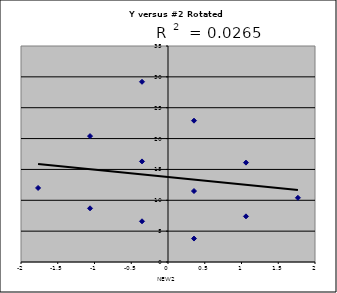
| Category | Y |
|---|---|
| 0.3535533905932736 | 3.8 |
| -0.35355339059327384 | 6.6 |
| -1.0606601717798214 | 8.7 |
| -1.7677669529663689 | 12 |
| 1.0606601717798212 | 7.4 |
| 0.35355339059327373 | 11.5 |
| -0.35355339059327373 | 16.3 |
| -1.0606601717798212 | 20.4 |
| 1.7677669529663689 | 10.4 |
| 1.0606601717798214 | 16.1 |
| 0.35355339059327384 | 22.9 |
| -0.3535533905932736 | 29.2 |